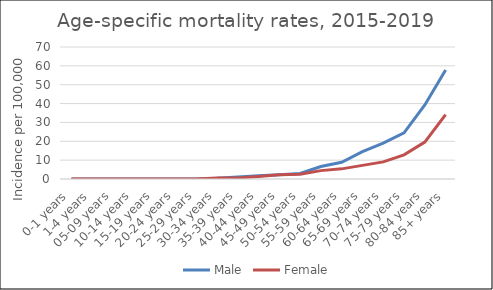
| Category | Male | Female |
|---|---|---|
| 0-1 years | 0 | 0 |
| 1-4 years | 0 | 0 |
| 05-09 years | 0 | 0 |
| 10-14 years | 0 | 0 |
| 15-19 years | 0 | 0 |
| 20-24 years | 0 | 0 |
| 25-29 years | 0 | 0 |
| 30-34 years | 0.39 | 0.49 |
| 35-39 years | 1.07 | 0.59 |
| 40-44 years | 1.72 | 1.28 |
| 45-49 years | 2.24 | 2.29 |
| 50-54 years | 2.95 | 2.51 |
| 55-59 years | 6.59 | 4.44 |
| 60-64 years | 8.88 | 5.38 |
| 65-69 years | 14.46 | 7.22 |
| 70-74 years | 19.01 | 9.06 |
| 75-79 years | 24.44 | 12.82 |
| 80-84 years | 39.27 | 19.56 |
| 85+ years | 57.8 | 34.16 |